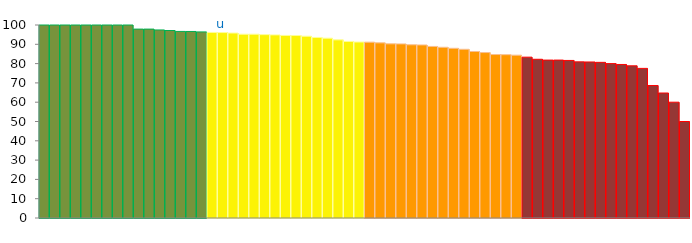
| Category | Top Quartile | 2nd Quartile | 3rd Quartile | Bottom Quartile | Series 4 |
|---|---|---|---|---|---|
|  | 100 | 0 | 0 | 0 | 100 |
|  | 100 | 0 | 0 | 0 | 100 |
|  | 100 | 0 | 0 | 0 | 100 |
|  | 100 | 0 | 0 | 0 | 100 |
|  | 100 | 0 | 0 | 0 | 100 |
|  | 100 | 0 | 0 | 0 | 100 |
|  | 100 | 0 | 0 | 0 | 100 |
|  | 100 | 0 | 0 | 0 | 100 |
|  | 100 | 0 | 0 | 0 | 100 |
|  | 97.872 | 0 | 0 | 0 | 97.872 |
|  | 97.872 | 0 | 0 | 0 | 97.872 |
|  | 97.436 | 0 | 0 | 0 | 97.436 |
|  | 97.143 | 0 | 0 | 0 | 97.143 |
|  | 96.667 | 0 | 0 | 0 | 96.667 |
|  | 96.644 | 0 | 0 | 0 | 96.644 |
|  | 96.429 | 0 | 0 | 0 | 96.429 |
|  | 0 | 96.154 | 0 | 0 | 96.154 |
| u | 0 | 96.078 | 0 | 0 | 96.078 |